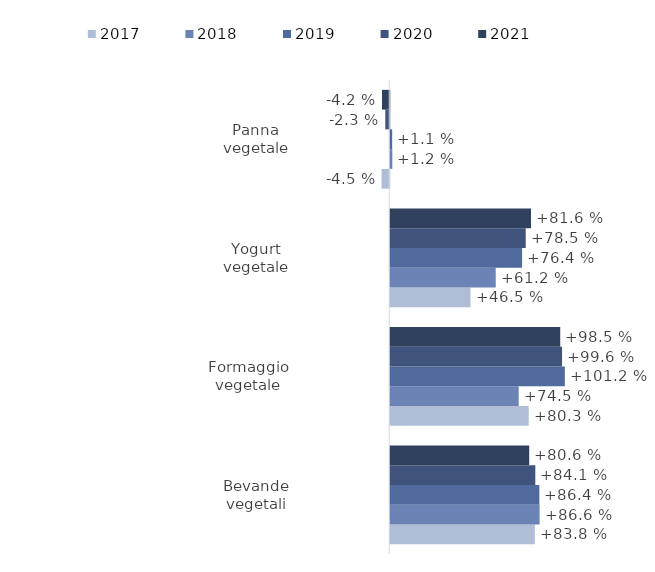
| Category | 2017 | 2018 | 2019 | 2020 | 2021 |
|---|---|---|---|---|---|
| Bevande vegetali | 0.838 | 0.866 | 0.864 | 0.841 | 0.806 |
| Formaggio vegetale | 0.803 | 0.745 | 1.012 | 0.996 | 0.985 |
| Yogurt vegetale | 0.465 | 0.612 | 0.764 | 0.785 | 0.816 |
| Panna vegetale | -0.045 | 0.012 | 0.011 | -0.023 | -0.042 |